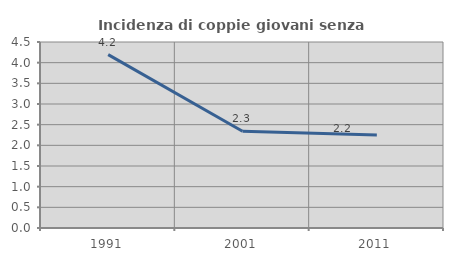
| Category | Incidenza di coppie giovani senza figli |
|---|---|
| 1991.0 | 4.194 |
| 2001.0 | 2.34 |
| 2011.0 | 2.247 |